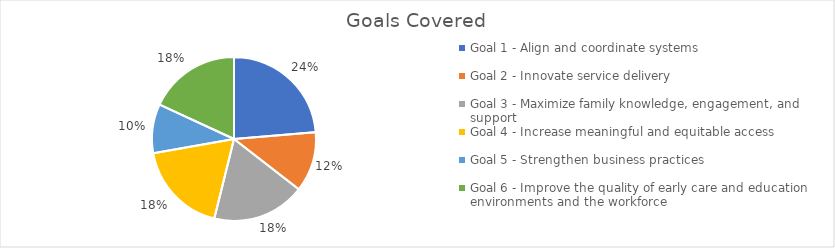
| Category | Count of activities |
|---|---|
| Goal 1 - Align and coordinate systems | 98 |
| Goal 2 - Innovate service delivery | 49 |
| Goal 3 - Maximize family knowledge, engagement, and support | 76 |
| Goal 4 - Increase meaningful and equitable access | 76 |
| Goal 5 - Strengthen business practices | 40 |
| Goal 6 - Improve the quality of early care and education environments and the workforce | 75 |